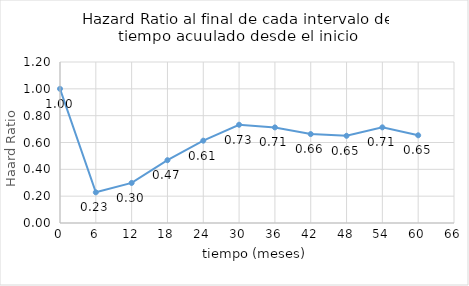
| Category | HRi |
|---|---|
| 0.0 | 1 |
| 6.0 | 0.229 |
| 12.0 | 0.299 |
| 18.0 | 0.468 |
| 24.0 | 0.614 |
| 30.0 | 0.732 |
| 36.0 | 0.713 |
| 42.0 | 0.663 |
| 48.0 | 0.65 |
| 54.0 | 0.713 |
| 60.0 | 0.654 |